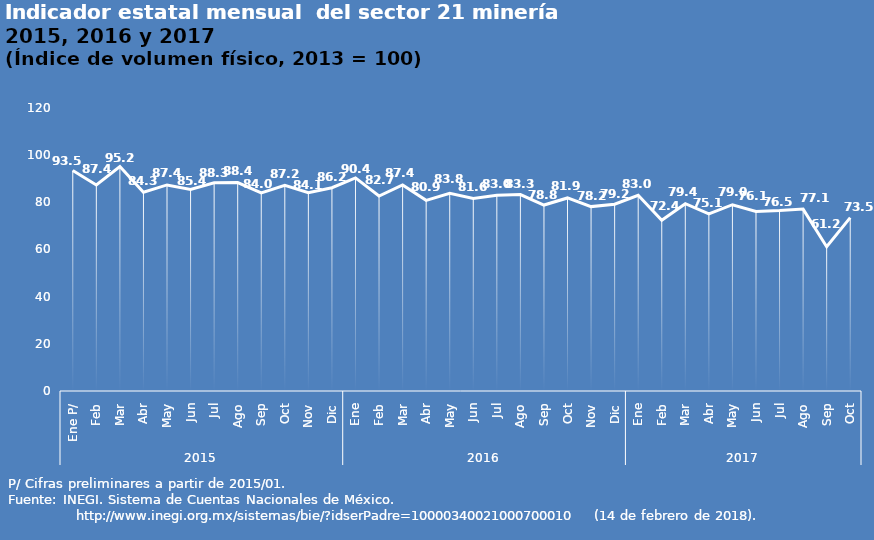
| Category | Series 0 |
|---|---|
| 0 | 93.518 |
| 1 | 87.364 |
| 2 | 95.151 |
| 3 | 84.267 |
| 4 | 87.378 |
| 5 | 85.438 |
| 6 | 88.327 |
| 7 | 88.362 |
| 8 | 83.967 |
| 9 | 87.17 |
| 10 | 84.052 |
| 11 | 86.208 |
| 12 | 90.381 |
| 13 | 82.659 |
| 14 | 87.362 |
| 15 | 80.85 |
| 16 | 83.821 |
| 17 | 81.646 |
| 18 | 82.969 |
| 19 | 83.294 |
| 20 | 78.845 |
| 21 | 81.857 |
| 22 | 78.189 |
| 23 | 79.177 |
| 24 | 82.98 |
| 25 | 72.433 |
| 26 | 79.405 |
| 27 | 75.077 |
| 28 | 78.993 |
| 29 | 76.114 |
| 30 | 76.505 |
| 31 | 77.123 |
| 32 | 61.15 |
| 33 | 73.501 |